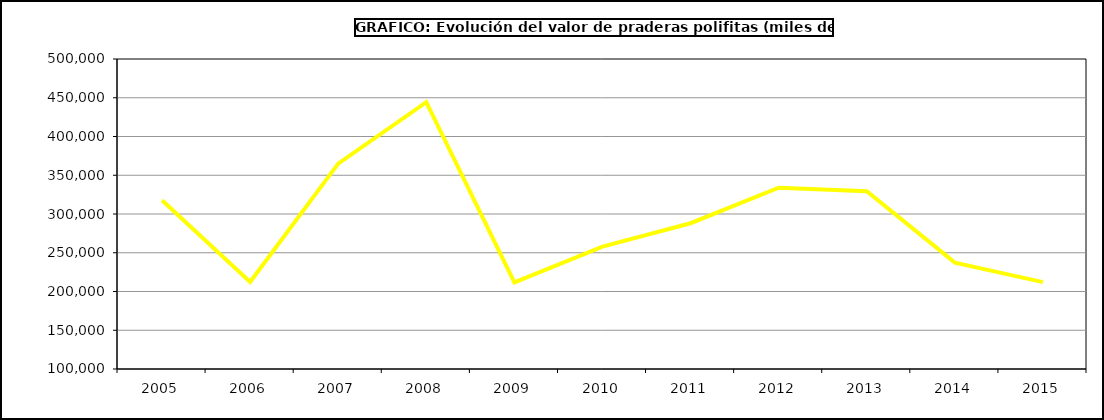
| Category | Valor |
|---|---|
| 2005.0 | 317847.335 |
| 2006.0 | 212371.598 |
| 2007.0 | 364940.217 |
| 2008.0 | 444361.431 |
| 2009.0 | 211697.199 |
| 2010.0 | 257899.036 |
| 2011.0 | 288090.963 |
| 2012.0 | 333939.944 |
| 2013.0 | 329402.741 |
| 2014.0 | 237285.995 |
| 2015.0 | 212093 |